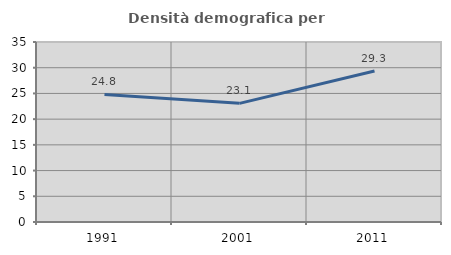
| Category | Densità demografica |
|---|---|
| 1991.0 | 24.793 |
| 2001.0 | 23.071 |
| 2011.0 | 29.346 |